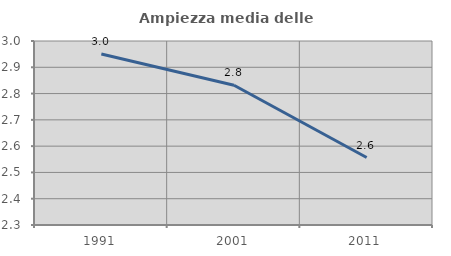
| Category | Ampiezza media delle famiglie |
|---|---|
| 1991.0 | 2.951 |
| 2001.0 | 2.832 |
| 2011.0 | 2.557 |